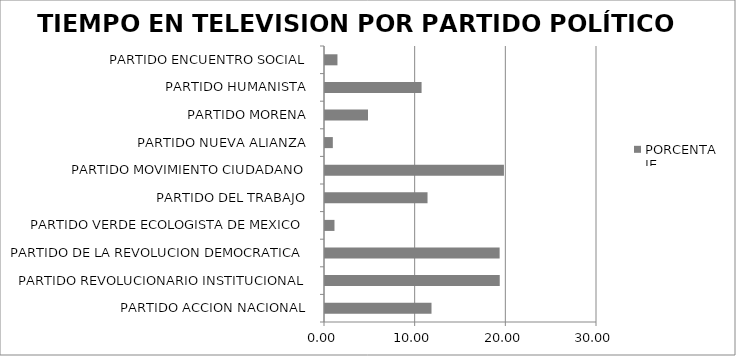
| Category | PORCENTAJE |
|---|---|
| PARTIDO ACCION NACIONAL | 11.746 |
| PARTIDO REVOLUCIONARIO INSTITUCIONAL | 19.273 |
| PARTIDO DE LA REVOLUCION DEMOCRATICA | 19.261 |
| PARTIDO VERDE ECOLOGISTA DE MEXICO | 1.046 |
| PARTIDO DEL TRABAJO | 11.308 |
| PARTIDO MOVIMIENTO CIUDADANO | 19.735 |
| PARTIDO NUEVA ALIANZA | 0.863 |
| PARTIDO MORENA | 4.742 |
| PARTIDO HUMANISTA | 10.652 |
| PARTIDO ENCUENTRO SOCIAL | 1.374 |